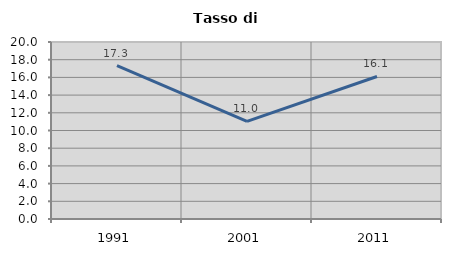
| Category | Tasso di disoccupazione   |
|---|---|
| 1991.0 | 17.34 |
| 2001.0 | 11.026 |
| 2011.0 | 16.104 |